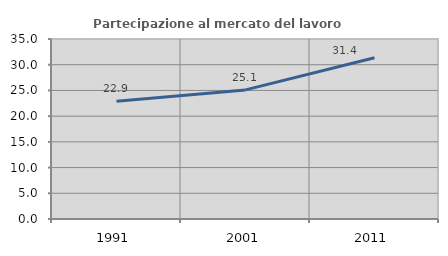
| Category | Partecipazione al mercato del lavoro  femminile |
|---|---|
| 1991.0 | 22.913 |
| 2001.0 | 25.102 |
| 2011.0 | 31.36 |